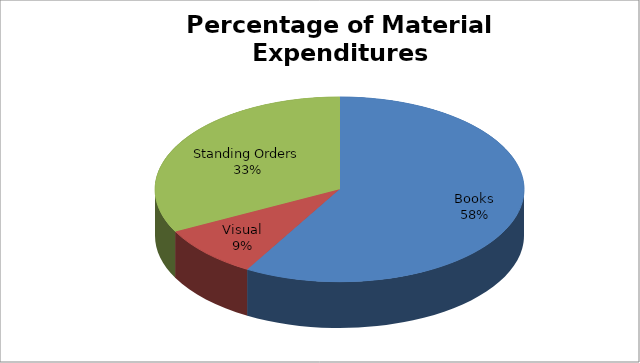
| Category | Series 0 |
|---|---|
| Books | 51129.32 |
| Visual | 7994.64 |
| Standing Orders | 28553.99 |